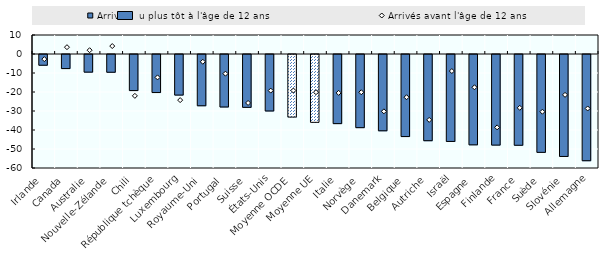
| Category | Arrivés au plus tôt à l'âge de 12 ans |
|---|---|
| Irlande | -5.651 |
| Canada | -7.402 |
| Australie | -9.281 |
| Nouvelle-Zélande | -9.35 |
| Chili | -18.983 |
| République tchèque | -20.019 |
| Luxembourg | -21.354 |
| Royaume-Uni | -26.976 |
| Portugal | -27.624 |
| Suisse | -27.817 |
| États-Unis | -29.727 |
| Moyenne OCDE | -32.94 |
| Moyenne UE | -35.7 |
| Italie | -36.377 |
| Norvège | -38.497 |
| Danemark | -40.151 |
| Belgique | -43.186 |
| Autriche | -45.37 |
| Israël | -45.76 |
| Espagne | -47.552 |
| Finlande | -47.683 |
| France | -47.775 |
| Suède | -51.511 |
| Slovénie | -53.664 |
| Allemagne | -55.9 |